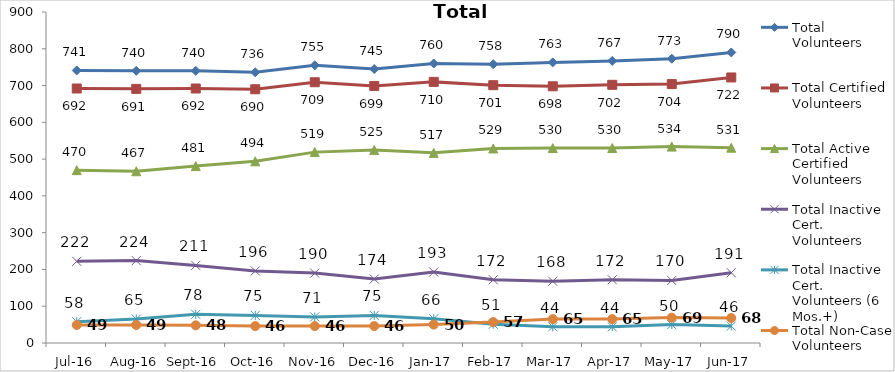
| Category | Total Volunteers | Total Certified Volunteers | Total Active Certified Volunteers | Total Inactive Cert. Volunteers | Total Inactive Cert. Volunteers (6 Mos.+) | Total Non-Case Volunteers |
|---|---|---|---|---|---|---|
| Jul-16 | 741 | 692 | 470 | 222 | 58 | 49 |
| Aug-16 | 740 | 691 | 467 | 224 | 65 | 49 |
| Sep-16 | 740 | 692 | 481 | 211 | 78 | 48 |
| Oct-16 | 736 | 690 | 494 | 196 | 75 | 46 |
| Nov-16 | 755 | 709 | 519 | 190 | 71 | 46 |
| Dec-16 | 745 | 699 | 525 | 174 | 75 | 46 |
| Jan-17 | 760 | 710 | 517 | 193 | 66 | 50 |
| Feb-17 | 758 | 701 | 529 | 172 | 51 | 57 |
| Mar-17 | 763 | 698 | 530 | 168 | 44 | 65 |
| Apr-17 | 767 | 702 | 530 | 172 | 44 | 65 |
| May-17 | 773 | 704 | 534 | 170 | 50 | 69 |
| Jun-17 | 790 | 722 | 531 | 191 | 46 | 68 |